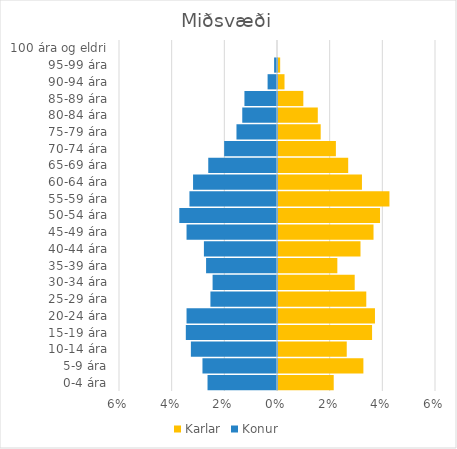
| Category | Karlar | Konur |
|---|---|---|
| 0-4 ára | 0.021 | -0.026 |
| 5-9 ára | 0.032 | -0.028 |
| 10-14 ára | 0.026 | -0.033 |
| 15-19 ára | 0.036 | -0.035 |
| 20-24 ára | 0.037 | -0.034 |
| 25-29 ára | 0.034 | -0.025 |
| 30-34 ára | 0.029 | -0.024 |
| 35-39 ára | 0.023 | -0.027 |
| 40-44 ára | 0.031 | -0.028 |
| 45-49 ára | 0.036 | -0.034 |
| 50-54 ára | 0.039 | -0.037 |
| 55-59 ára | 0.042 | -0.033 |
| 60-64 ára | 0.032 | -0.032 |
| 65-69 ára | 0.027 | -0.026 |
| 70-74 ára | 0.022 | -0.02 |
| 75-79 ára | 0.016 | -0.015 |
| 80-84 ára | 0.015 | -0.013 |
| 85-89 ára | 0.01 | -0.012 |
| 90-94 ára | 0.002 | -0.004 |
| 95-99 ára | 0.001 | -0.001 |
| 100 ára og eldri | 0 | 0 |